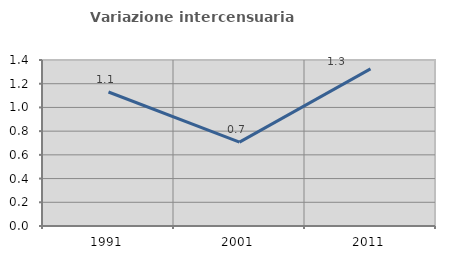
| Category | Variazione intercensuaria annua |
|---|---|
| 1991.0 | 1.13 |
| 2001.0 | 0.707 |
| 2011.0 | 1.325 |